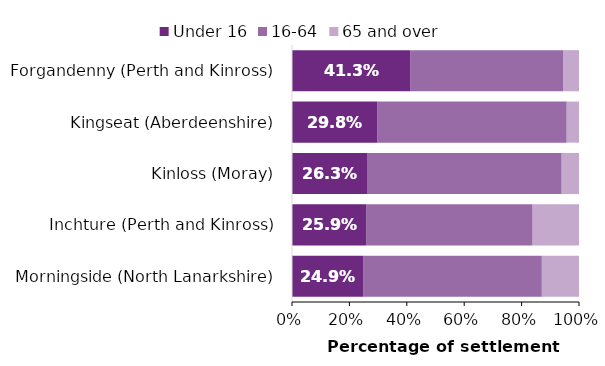
| Category | Under 16 | 16-64 | 65 and over |
|---|---|---|---|
| Morningside (North Lanarkshire) | 0.249 | 0.622 | 0.13 |
| Inchture (Perth and Kinross) | 0.259 | 0.578 | 0.163 |
| Kinloss (Moray) | 0.263 | 0.676 | 0.061 |
| Kingseat (Aberdeenshire) | 0.298 | 0.659 | 0.043 |
| Forgandenny (Perth and Kinross) | 0.412 | 0.532 | 0.055 |